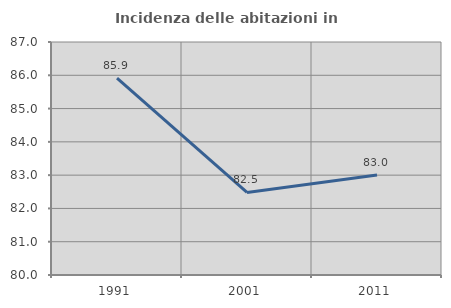
| Category | Incidenza delle abitazioni in proprietà  |
|---|---|
| 1991.0 | 85.915 |
| 2001.0 | 82.48 |
| 2011.0 | 83.002 |